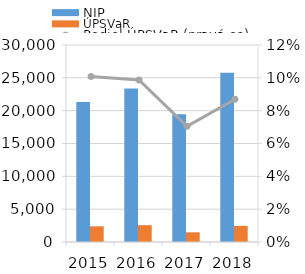
| Category | NIP | ÚPSVaR |
|---|---|---|
| 2015.0 | 21309 | 2389 |
| 2016.0 | 23372 | 2559 |
| 2017.0 | 19469 | 1476 |
| 2018.0 | 25769 | 2454 |